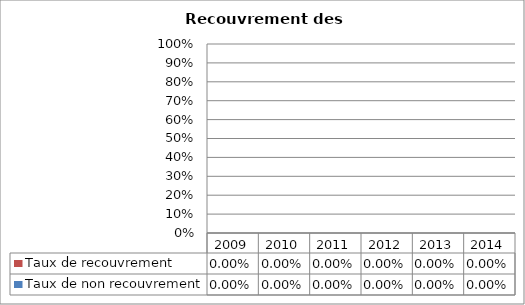
| Category | Taux de non recouvrement | Taux de recouvrement |
|---|---|---|
| 2009.0 | 0 | 0 |
| 2010.0 | 0 | 0 |
| 2011.0 | 0 | 0 |
| 2012.0 | 0 | 0 |
| 2013.0 | 0 | 0 |
| 2014.0 | 0 | 0 |